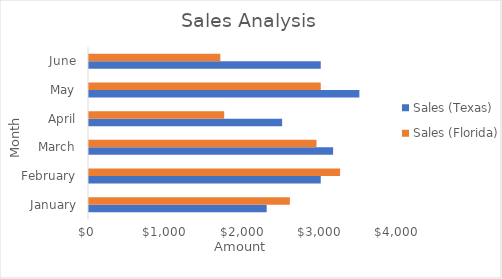
| Category | Sales (Texas) | Sales (Florida) |
|---|---|---|
| January | 2300 | 2600 |
| February | 3000 | 3250 |
| March | 3160 | 2945 |
| April | 2500 | 1750 |
| May | 3500 | 3000 |
| June | 3000 | 1700 |